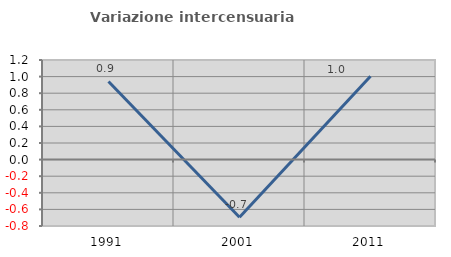
| Category | Variazione intercensuaria annua |
|---|---|
| 1991.0 | 0.942 |
| 2001.0 | -0.695 |
| 2011.0 | 1.004 |